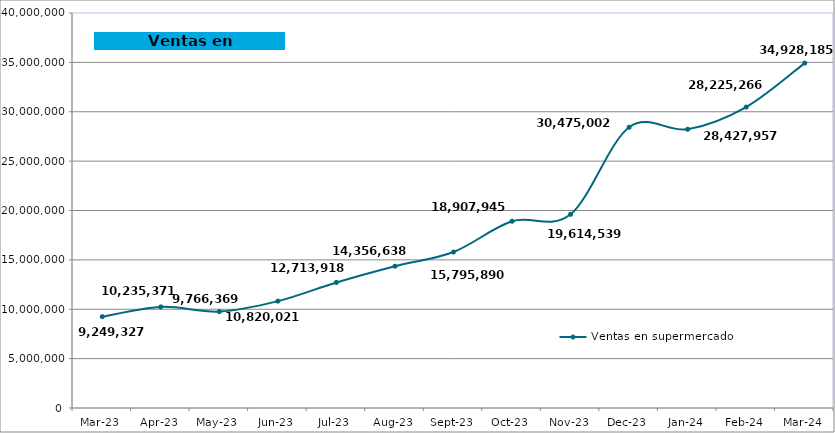
| Category | Ventas en supermercado |
|---|---|
| 2023-03-01 | 9249326.686 |
| 2023-04-01 | 10235371.171 |
| 2023-05-01 | 9766368.874 |
| 2023-06-01 | 10820021.178 |
| 2023-07-01 | 12713917.516 |
| 2023-08-01 | 14356638.287 |
| 2023-09-01 | 15795890.013 |
| 2023-10-01 | 18907944.622 |
| 2023-11-01 | 19614538.791 |
| 2023-12-01 | 28427957.214 |
| 2024-01-01 | 28225265.767 |
| 2024-02-01 | 30475001.702 |
| 2024-03-01 | 34928185.049 |